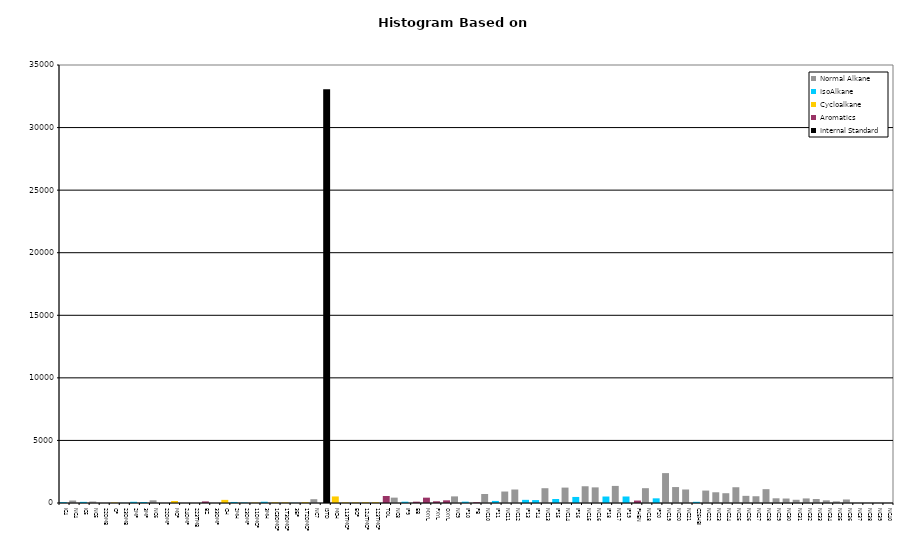
| Category | Normal Alkane | IsoAlkane | Cycloalkane | Aromatics | Internal Standard |
|---|---|---|---|---|---|
| IC4 | 0 | 68 | 0 | 0 | 0 |
| NC4 | 199 | 0 | 0 | 0 | 0 |
| IC5 | 0 | 91 | 0 | 0 | 0 |
| NC5 | 118 | 0 | 0 | 0 | 0 |
| 22DMB | 0 | 0 | 0 | 0 | 0 |
| CP | 0 | 0 | 33 | 0 | 0 |
| 23DMB | 0 | 10 | 0 | 0 | 0 |
| 2MP | 0 | 97 | 0 | 0 | 0 |
| 3MP | 0 | 80 | 0 | 0 | 0 |
| NC6 | 217 | 0 | 0 | 0 | 0 |
| 22DMP | 0 | 0 | 0 | 0 | 0 |
| MCP | 0 | 0 | 158 | 0 | 0 |
| 24DMP | 0 | 0 | 0 | 0 | 0 |
| 223TMB | 0 | 0 | 0 | 0 | 0 |
| BZ | 0 | 0 | 0 | 128 | 0 |
| 33DMP | 0 | 0 | 0 | 0 | 0 |
| CH | 0 | 0 | 250 | 0 | 0 |
| 2MH | 0 | 83 | 0 | 0 | 0 |
| 23DMP | 0 | 39 | 0 | 0 | 0 |
| 11DMCP | 0 | 0 | 31 | 0 | 0 |
| 3MH | 0 | 102 | 0 | 0 | 0 |
| 1C3DMCP | 0 | 0 | 51 | 0 | 0 |
| 1T3DMCP | 0 | 0 | 46 | 0 | 0 |
| 3EP | 0 | 11 | 0 | 0 | 0 |
| 1T2DMCP | 0 | 0 | 62 | 0 | 0 |
| NC7 | 304 | 0 | 0 | 0 | 0 |
| ISTD | 0 | 0 | 0 | 0 | 33057 |
| MCH | 0 | 0 | 524 | 0 | 0 |
| 113TMCP | 0 | 0 | 47 | 0 | 0 |
| ECP | 0 | 0 | 44 | 0 | 0 |
| 124TMCP | 0 | 0 | 56 | 0 | 0 |
| 123TMCP | 0 | 0 | 59 | 0 | 0 |
| TOL | 0 | 0 | 0 | 560 | 0 |
| NC8 | 429 | 0 | 0 | 0 | 0 |
| IP9 | 0 | 105 | 0 | 0 | 0 |
| EB | 0 | 0 | 0 | 106 | 0 |
| MXYL | 0 | 0 | 0 | 427 | 0 |
| PXYL | 0 | 0 | 0 | 137 | 0 |
| OXYL | 0 | 0 | 0 | 214 | 0 |
| NC9 | 529 | 0 | 0 | 0 | 0 |
| IP10 | 0 | 108 | 0 | 0 | 0 |
| PB | 0 | 0 | 0 | 58 | 0 |
| NC10 | 721 | 0 | 0 | 0 | 0 |
| IP11 | 0 | 166 | 0 | 0 | 0 |
| NC11 | 917 | 0 | 0 | 0 | 0 |
| NC12 | 1078 | 0 | 0 | 0 | 0 |
| IP13 | 0 | 252 | 0 | 0 | 0 |
| IP14 | 0 | 234 | 0 | 0 | 0 |
| NC13 | 1182 | 0 | 0 | 0 | 0 |
| IP15 | 0 | 318 | 0 | 0 | 0 |
| NC14 | 1231 | 0 | 0 | 0 | 0 |
| IP16 | 0 | 484 | 0 | 0 | 0 |
| NC15 | 1339 | 0 | 0 | 0 | 0 |
| NC16 | 1249 | 0 | 0 | 0 | 0 |
| IP18 | 0 | 518 | 0 | 0 | 0 |
| NC17 | 1365 | 0 | 0 | 0 | 0 |
| IP19 | 0 | 520 | 0 | 0 | 0 |
| PHEN | 0 | 0 | 0 | 196 | 0 |
| NC18 | 1184 | 0 | 0 | 0 | 0 |
| IP20 | 0 | 373 | 0 | 0 | 0 |
| NC19 | 2389 | 0 | 0 | 0 | 0 |
| NC20 | 1274 | 0 | 0 | 0 | 0 |
| NC21 | 1080 | 0 | 0 | 0 | 0 |
| C25HBI | 0 | 95 | 0 | 0 | 0 |
| NC22 | 994 | 0 | 0 | 0 | 0 |
| NC23 | 858 | 0 | 0 | 0 | 0 |
| NC24 | 782 | 0 | 0 | 0 | 0 |
| NC25 | 1260 | 0 | 0 | 0 | 0 |
| NC26 | 571 | 0 | 0 | 0 | 0 |
| NC27 | 540 | 0 | 0 | 0 | 0 |
| NC28 | 1106 | 0 | 0 | 0 | 0 |
| NC29 | 376 | 0 | 0 | 0 | 0 |
| NC30 | 358 | 0 | 0 | 0 | 0 |
| NC31 | 258 | 0 | 0 | 0 | 0 |
| NC32 | 366 | 0 | 0 | 0 | 0 |
| NC33 | 318 | 0 | 0 | 0 | 0 |
| NC34 | 214 | 0 | 0 | 0 | 0 |
| NC35 | 131 | 0 | 0 | 0 | 0 |
| NC36 | 282 | 0 | 0 | 0 | 0 |
| NC37 | 0 | 0 | 0 | 0 | 0 |
| NC38 | 0 | 0 | 0 | 0 | 0 |
| NC39 | 0 | 0 | 0 | 0 | 0 |
| NC40 | 0 | 0 | 0 | 0 | 0 |